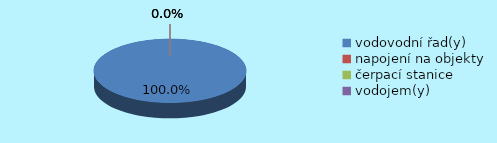
| Category | Series 0 | Series 1 |
|---|---|---|
| vodovodní řad(y) | 1890628.921 |  |
| napojení na objekty | 0 |  |
| čerpací stanice | 0 |  |
| vodojem(y) | 0 |  |